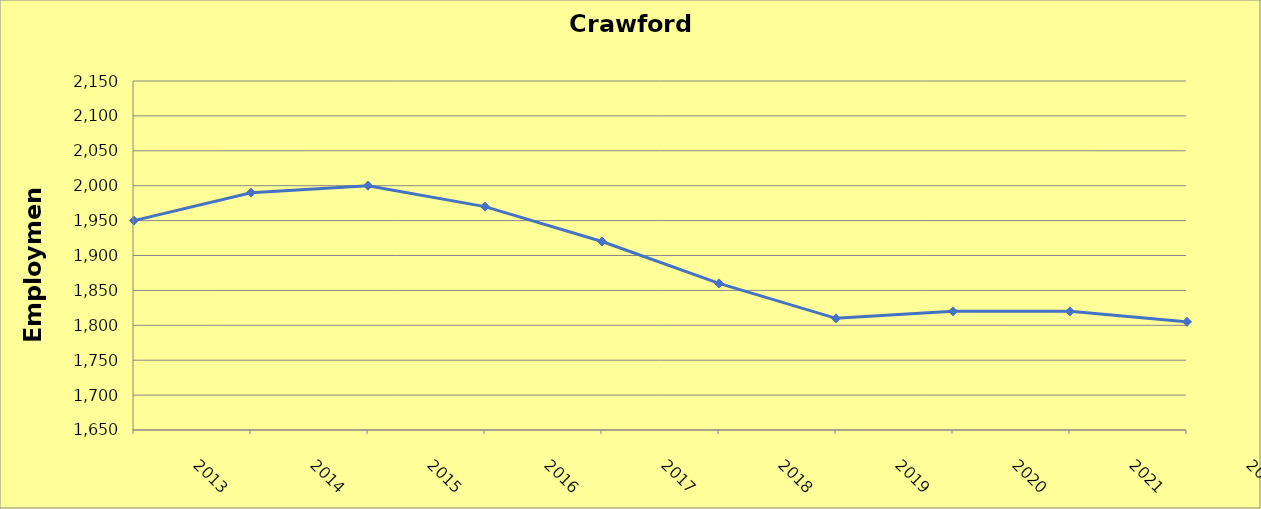
| Category | Crawford County |
|---|---|
| 2013.0 | 1950 |
| 2014.0 | 1990 |
| 2015.0 | 2000 |
| 2016.0 | 1970 |
| 2017.0 | 1920 |
| 2018.0 | 1860 |
| 2019.0 | 1810 |
| 2020.0 | 1820 |
| 2021.0 | 1820 |
| 2022.0 | 1805 |